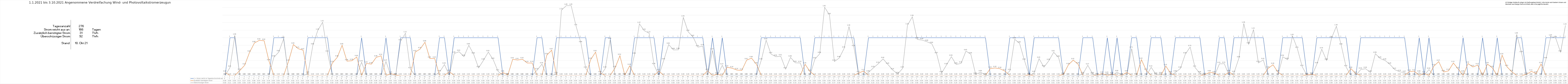
| Category | 1 = Strom reicht im Tagesdurchschnitt aus | Zusätzlich benötigter Strom | Überschüssiger Strom |
|---|---|---|---|
| 0 | 0 | 0.08 | 0 |
| 1 | 1 | 0 | 0.21 |
| 2 | 1 | 0 | 1.06 |
| 3 | 0 | 0.13 | 0 |
| 4 | 0 | 0.27 | 0 |
| 5 | 0 | 0.61 | 0 |
| 6 | 0 | 0.86 | 0 |
| 7 | 0 | 0.93 | 0 |
| 8 | 0 | 0.92 | 0 |
| 9 | 0 | 0.38 | 0 |
| 10 | 1 | 0 | 0.48 |
| 11 | 1 | 0 | 0.62 |
| 12 | 1 | 0 | 0.97 |
| 13 | 0 | 0.37 | 0 |
| 14 | 0 | 0.82 | 0 |
| 15 | 0 | 0.71 | 0 |
| 16 | 0 | 0.67 | 0 |
| 17 | 1 | 0 | 0.05 |
| 18 | 1 | 0 | 0.8 |
| 19 | 1 | 0 | 1.19 |
| 20 | 1 | 0 | 1.41 |
| 21 | 1 | 0 | 0.61 |
| 22 | 0 | 0.33 | 0 |
| 23 | 0 | 0.48 | 0 |
| 24 | 0 | 0.8 | 0 |
| 25 | 0 | 0.38 | 0 |
| 26 | 0 | 0.39 | 0 |
| 27 | 0 | 0.49 | 0 |
| 28 | 1 | 0 | 0.35 |
| 29 | 0 | 0.32 | 0 |
| 30 | 0 | 0.3 | 0 |
| 31 | 0 | 0.48 | 0 |
| 32 | 0 | 0.52 | 0 |
| 33 | 1 | 0 | 0.37 |
| 34 | 0 | 0.05 | 0 |
| 35 | 0 | 0.01 | 0 |
| 36 | 1 | 0 | 0.91 |
| 37 | 1 | 0 | 1.12 |
| 38 | 1 | 0 | 0.17 |
| 39 | 0 | 0.62 | 0 |
| 40 | 0 | 0.7 | 0 |
| 41 | 0 | 0.88 | 0 |
| 42 | 0 | 0.45 | 0 |
| 43 | 0 | 0.45 | 0 |
| 44 | 1 | 0 | 0.09 |
| 45 | 1 | 0 | 0.29 |
| 46 | 0 | 0.1 | 0 |
| 47 | 1 | 0 | 0.58 |
| 48 | 1 | 0 | 0.63 |
| 49 | 1 | 0 | 0.5 |
| 50 | 1 | 0 | 0.8 |
| 51 | 1 | 0 | 0.56 |
| 52 | 1 | 0 | 0.2 |
| 53 | 1 | 0 | 0.4 |
| 54 | 1 | 0 | 0.62 |
| 55 | 1 | 0 | 0.42 |
| 56 | 1 | 0 | 0.11 |
| 57 | 0 | 0.08 | 0 |
| 58 | 0 | 0.01 | 0 |
| 59 | 0 | 0.43 | 0 |
| 60 | 0 | 0.41 | 0 |
| 61 | 0 | 0.43 | 0 |
| 62 | 0 | 0.33 | 0 |
| 63 | 0 | 0.33 | 0 |
| 64 | 1 | 0 | 0.14 |
| 65 | 1 | 0 | 0.3 |
| 66 | 0 | 0.54 | 0 |
| 67 | 0 | 0.67 | 0 |
| 68 | 1 | 0 | 0.04 |
| 69 | 1 | 0 | 1.73 |
| 70 | 1 | 0 | 1.85 |
| 71 | 1 | 0 | 1.85 |
| 72 | 1 | 0 | 1.31 |
| 73 | 1 | 0 | 0.861 |
| 74 | 1 | 0 | 0.185 |
| 75 | 0 | 0.42 | 0 |
| 76 | 0 | 0.619 | 0 |
| 77 | 0 | 0.064 | 0 |
| 78 | 1 | 0 | 0.187 |
| 79 | 1 | 0 | 0.946 |
| 80 | 0 | 0.198 | 0 |
| 81 | 0 | 0.523 | 0 |
| 82 | 0 | 0.007 | 0 |
| 83 | 0 | 0.257 | 0 |
| 84 | 1 | 0 | 0.555 |
| 85 | 1 | 0 | 1.369 |
| 86 | 1 | 0 | 1.186 |
| 87 | 1 | 0 | 1.12 |
| 88 | 1 | 0 | 0.278 |
| 89 | 0 | 0.117 | 0 |
| 90 | 1 | 0 | 0.403 |
| 91 | 1 | 0 | 0.819 |
| 92 | 1 | 0 | 0.676 |
| 93 | 1 | 0 | 0.681 |
| 94 | 1 | 0 | 1.541 |
| 95 | 1 | 0 | 1.158 |
| 96 | 1 | 0 | 1.022 |
| 97 | 1 | 0 | 0.752 |
| 98 | 1 | 0 | 0.776 |
| 99 | 0 | 0.123 | 0 |
| 100 | 1 | 0 | 0.665 |
| 101 | 0 | 0.034 | 0 |
| 102 | 1 | 0 | 0.269 |
| 103 | 0 | 0.218 | 0 |
| 104 | 0 | 0.193 | 0 |
| 105 | 0 | 0.144 | 0 |
| 106 | 0 | 0.133 | 0 |
| 107 | 0 | 0.407 | 0 |
| 108 | 0 | 0.46 | 0 |
| 109 | 0 | 0.3 | 0 |
| 110 | 1 | 0 | 0.402 |
| 111 | 1 | 0 | 0.934 |
| 112 | 1 | 0 | 0.567 |
| 113 | 1 | 0 | 0.498 |
| 114 | 1 | 0 | 0.509 |
| 115 | 1 | 0 | 0.167 |
| 116 | 1 | 0 | 0.478 |
| 117 | 1 | 0 | 0.336 |
| 118 | 1 | 0 | 0.331 |
| 119 | 0 | 0.296 | 0 |
| 120 | 0 | 0.103 | 0 |
| 121 | 1 | 0 | 0.432 |
| 122 | 1 | 0 | 0.575 |
| 123 | 1 | 0 | 1.808 |
| 124 | 1 | 0 | 1.602 |
| 125 | 1 | 0 | 0.369 |
| 126 | 1 | 0 | 0.463 |
| 127 | 1 | 0 | 0.716 |
| 128 | 1 | 0 | 1.296 |
| 129 | 1 | 0 | 0.755 |
| 130 | 0 | 0.067 | 0 |
| 131 | 0 | 0.117 | 0 |
| 132 | 1 | 0 | 0.081 |
| 133 | 1 | 0 | 0.2 |
| 134 | 1 | 0 | 0.31 |
| 135 | 1 | 0 | 0.44 |
| 136 | 1 | 0 | 0.289 |
| 137 | 1 | 0 | 0.142 |
| 138 | 1 | 0 | 0.041 |
| 139 | 1 | 0 | 0.186 |
| 140 | 1 | 0 | 1.332 |
| 141 | 1 | 0 | 1.555 |
| 142 | 1 | 0 | 0.955 |
| 143 | 1 | 0 | 0.938 |
| 144 | 1 | 0 | 0.894 |
| 145 | 1 | 0 | 0.838 |
| 146 | 1 | 0 | 0.567 |
| 147 | 1 | 0 | 0.064 |
| 148 | 1 | 0 | 0.276 |
| 149 | 1 | 0 | 0.498 |
| 150 | 1 | 0 | 0.292 |
| 151 | 1 | 0 | 0.321 |
| 152 | 1 | 0 | 0.646 |
| 153 | 1 | 0 | 0.563 |
| 154 | 1 | 0 | 0.026 |
| 155 | 1 | 0 | 0.087 |
| 156 | 1 | 0 | 0.009 |
| 157 | 0 | 0.184 | 0 |
| 158 | 0 | 0.199 | 0 |
| 159 | 0 | 0.177 | 0 |
| 160 | 0 | 0.116 | 0 |
| 161 | 1 | 0 | 0.12 |
| 162 | 1 | 0 | 0.959 |
| 163 | 1 | 0 | 0.851 |
| 164 | 1 | 0 | 0.397 |
| 165 | 0 | 0.017 | 0 |
| 166 | 1 | 0 | 0.069 |
| 167 | 1 | 0 | 0.445 |
| 168 | 1 | 0 | 0.221 |
| 169 | 1 | 0 | 0.389 |
| 170 | 1 | 0 | 0.615 |
| 171 | 1 | 0 | 0.476 |
| 172 | 0 | 0.027 | 0 |
| 173 | 0 | 0.28 | 0 |
| 174 | 0 | 0.406 | 0 |
| 175 | 0 | 0.3 | 0 |
| 176 | 1 | 0 | 0.042 |
| 177 | 1 | 0 | 0.271 |
| 178 | 1 | 0 | 0.038 |
| 179 | 0 | 0.014 | 0 |
| 180 | 0 | 0.049 | 0 |
| 181 | 1 | 0 | 0.046 |
| 182 | 0 | 0.038 | 0 |
| 183 | 1 | 0 | 0.09 |
| 184 | 0 | 0.005 | 0 |
| 185 | 0 | 0.084 | 0 |
| 186 | 1 | 0 | 0.711 |
| 187 | 1 | 0 | 0.006 |
| 188 | 0 | 0.419 | 0 |
| 189 | 0 | 0.129 | 0 |
| 190 | 1 | 0 | 0.215 |
| 191 | 1 | 0 | 0.026 |
| 192 | 1 | 0 | 0.038 |
| 193 | 0 | 0.249 | 0 |
| 194 | 0 | 0.057 | 0 |
| 195 | 1 | 0 | 0.084 |
| 196 | 1 | 0 | 0.185 |
| 197 | 1 | 0 | 0.563 |
| 198 | 1 | 0 | 0.753 |
| 199 | 1 | 0 | 0.212 |
| 200 | 1 | 0 | 0.058 |
| 201 | 0 | 0.018 | 0 |
| 202 | 0 | 0.087 | 0 |
| 203 | 0 | 0.063 | 0 |
| 204 | 1 | 0 | 0.307 |
| 205 | 1 | 0 | 0.312 |
| 206 | 0 | 0.092 | 0 |
| 207 | 1 | 0 | 0.071 |
| 208 | 1 | 0 | 0.458 |
| 209 | 1 | 0 | 1.377 |
| 210 | 1 | 0 | 0.826 |
| 211 | 1 | 0 | 1.216 |
| 212 | 1 | 0 | 0.333 |
| 213 | 1 | 0 | 0.411 |
| 214 | 0 | 0.189 | 0 |
| 215 | 0 | 0.284 | 0 |
| 216 | 0 | 0.088 | 0 |
| 217 | 1 | 0 | 0.496 |
| 218 | 1 | 0 | 0.417 |
| 219 | 1 | 0 | 1.046 |
| 220 | 1 | 0 | 0.708 |
| 221 | 1 | 0 | 0.229 |
| 222 | 0 | 0.015 | 0 |
| 223 | 0 | 0.029 | 0 |
| 224 | 1 | 0 | 0.301 |
| 225 | 1 | 0 | 0.696 |
| 226 | 1 | 0 | 0.397 |
| 227 | 1 | 0 | 0.987 |
| 228 | 1 | 0 | 1.305 |
| 229 | 1 | 0 | 0.797 |
| 230 | 1 | 0 | 0.223 |
| 231 | 0 | 0.18 | 0 |
| 232 | 0 | 0.049 | 0 |
| 233 | 1 | 0 | 0.158 |
| 234 | 1 | 0 | 0.178 |
| 235 | 1 | 0 | 0.078 |
| 236 | 1 | 0 | 0.577 |
| 237 | 1 | 0 | 0.449 |
| 238 | 1 | 0 | 0.398 |
| 239 | 1 | 0 | 0.292 |
| 240 | 1 | 0 | 0.153 |
| 241 | 1 | 0 | 0.097 |
| 242 | 1 | 0 | 0.074 |
| 243 | 0 | 0.103 | 0 |
| 244 | 0 | 0.112 | 0 |
| 245 | 1 | 0 | 0.078 |
| 246 | 0 | 0.056 | 0 |
| 247 | 1 | 0 | 0.156 |
| 248 | 0 | 0.249 | 0 |
| 249 | 0 | 0.367 | 0 |
| 250 | 0 | 0.092 | 0 |
| 251 | 0 | 0.123 | 0 |
| 252 | 0 | 0.331 | 0 |
| 253 | 0 | 0.17 | 0 |
| 254 | 1 | 0 | 0.078 |
| 255 | 0 | 0.317 | 0 |
| 256 | 0 | 0.226 | 0 |
| 257 | 0 | 0.274 | 0 |
| 258 | 1 | 0 | 0.02 |
| 259 | 0 | 0.301 | 0 |
| 260 | 0 | 0.203 | 0 |
| 261 | 1 | 0 | 0.011 |
| 262 | 0 | 0.537 | 0 |
| 263 | 0 | 0.23 | 0 |
| 264 | 0 | 0.096 | 0 |
| 265 | 1 | 0 | 1.087 |
| 266 | 1 | 0 | 0.594 |
| 267 | 0 | 0.029 | 0 |
| 268 | 0 | 0.108 | 0 |
| 269 | 0 | 0.055 | 0 |
| 270 | 0 | 0.304 | 0 |
| 271 | 1 | 0 | 0.433 |
| 272 | 1 | 0 | 1.035 |
| 273 | 1 | 0 | 0.991 |
| 274 | 1 | 0 | 0.612 |
| 275 | 1 | 0 | 1.327 |